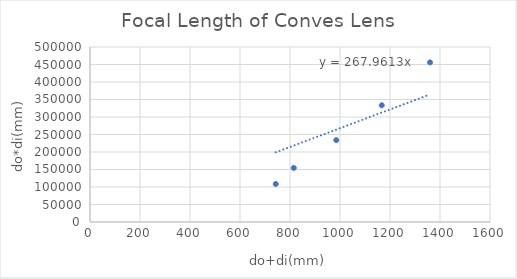
| Category | do*di(mm) |
|---|---|
| 743.0 | 108600 |
| 815.0 | 154500 |
| 985.0 | 234000 |
| 1167.0 | 333500 |
| 1360.0 | 456000 |